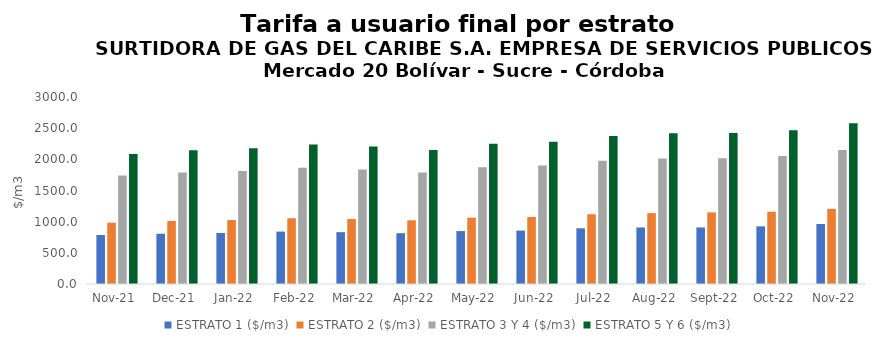
| Category | ESTRATO 1 ($/m3) | ESTRATO 2 ($/m3) | ESTRATO 3 Y 4 ($/m3) | ESTRATO 5 Y 6 ($/m3) |
|---|---|---|---|---|
| 2021-11-01 | 785.55 | 984.37 | 1739.24 | 2087.088 |
| 2021-12-01 | 806.47 | 1011.33 | 1789.2 | 2147.04 |
| 2022-01-01 | 818.77 | 1026.2 | 1814.11 | 2176.932 |
| 2022-02-01 | 840.84 | 1054.98 | 1864.59 | 2237.508 |
| 2022-03-01 | 831.68 | 1043.33 | 1838.57 | 2206.284 |
| 2022-04-01 | 815.29 | 1022.06 | 1790.68 | 2148.816 |
| 2022-05-01 | 849.49 | 1064.9 | 1874.06 | 2248.872 |
| 2022-06-01 | 856.82 | 1075.55 | 1900.19 | 2280.228 |
| 2022-07-01 | 894.13 | 1119.13 | 1978.46 | 2374.152 |
| 2022-08-01 | 907.16 | 1137.37 | 2014.17 | 2417.004 |
| 2022-09-01 | 907.44 | 1149 | 2018.96 | 2422.752 |
| 2022-10-01 | 924.96 | 1159.68 | 2054.17 | 2465.004 |
| 2022-11-01 | 962.82 | 1206.32 | 2147.73 | 2577.276 |